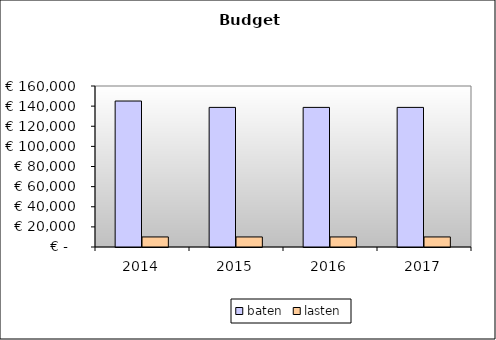
| Category | baten | lasten |
|---|---|---|
| 2014.0 | 145067.64 | 10000 |
| 2015.0 | 138734.53 | 10000 |
| 2016.0 | 138734.53 | 10000 |
| 2017.0 | 138734.53 | 10000 |